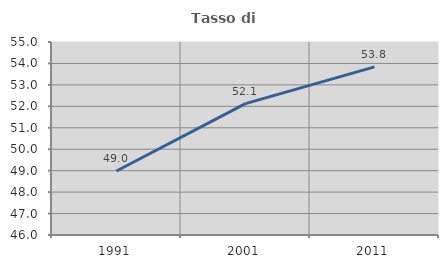
| Category | Tasso di occupazione   |
|---|---|
| 1991.0 | 48.985 |
| 2001.0 | 52.126 |
| 2011.0 | 53.84 |